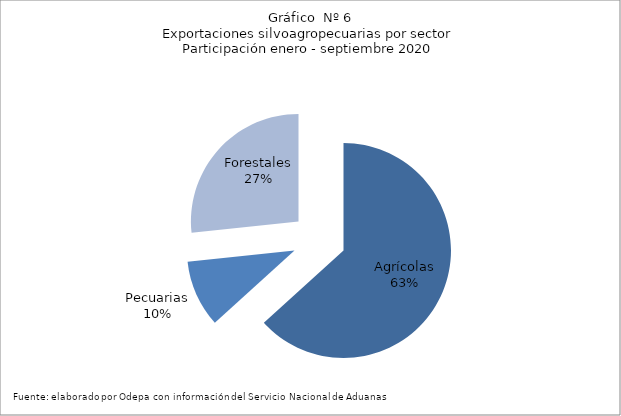
| Category | Series 0 |
|---|---|
| Agrícolas | 7592722 |
| Pecuarias | 1207485 |
| Forestales | 3198118 |